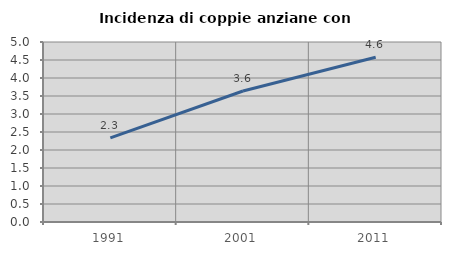
| Category | Incidenza di coppie anziane con figli |
|---|---|
| 1991.0 | 2.339 |
| 2001.0 | 3.639 |
| 2011.0 | 4.576 |